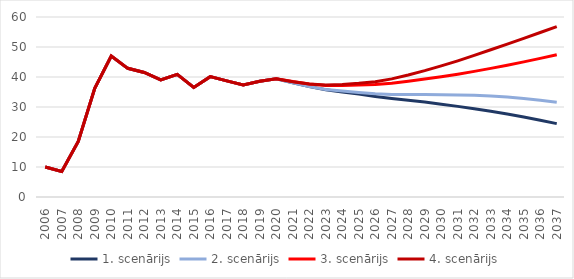
| Category | 1. scenārijs | 2. scenārijs | 3. scenārijs | 4. scenārijs |
|---|---|---|---|---|
| 2006 | 10.012 | 10.012 | 10.012 | 10.012 |
| 2007 | 8.507 | 8.507 | 8.507 | 8.507 |
| 2008 | 18.523 | 18.523 | 18.523 | 18.523 |
| 2009 | 36.251 | 36.251 | 36.251 | 36.251 |
| 2010 | 46.992 | 46.992 | 46.992 | 46.992 |
| 2011 | 42.89 | 42.89 | 42.89 | 42.89 |
| 2012 | 41.516 | 41.516 | 41.516 | 41.516 |
| 2013 | 39.027 | 39.027 | 39.027 | 39.027 |
| 2014 | 40.879 | 40.879 | 40.879 | 40.879 |
| 2015 | 36.518 | 36.518 | 36.518 | 36.518 |
| 2016 | 40.119 | 40.119 | 40.119 | 40.119 |
| 2017 | 38.716 | 38.716 | 38.716 | 38.716 |
| 2018 | 37.349 | 37.349 | 37.349 | 37.349 |
| 2019 | 38.588 | 38.588 | 38.588 | 38.588 |
| 2020 | 39.4 | 39.4 | 39.4 | 39.4 |
| 2021 | 38.11 | 38.054 | 38.485 | 38.43 |
| 2022 | 36.784 | 36.793 | 37.647 | 37.656 |
| 2023 | 35.726 | 35.849 | 37.19 | 37.316 |
| 2024 | 35.007 | 35.336 | 37.197 | 37.538 |
| 2025 | 34.289 | 34.841 | 37.323 | 37.9 |
| 2026 | 33.523 | 34.407 | 37.514 | 38.453 |
| 2027 | 32.859 | 34.188 | 37.94 | 39.376 |
| 2028 | 32.281 | 34.172 | 38.589 | 40.673 |
| 2029 | 31.648 | 34.147 | 39.306 | 42.116 |
| 2030 | 30.948 | 34.103 | 40.078 | 43.698 |
| 2031 | 30.206 | 34.015 | 40.936 | 45.394 |
| 2032 | 29.419 | 33.876 | 41.879 | 47.203 |
| 2033 | 28.564 | 33.643 | 42.877 | 49.069 |
| 2034 | 27.639 | 33.295 | 43.93 | 50.966 |
| 2035 | 26.649 | 32.834 | 45.042 | 52.89 |
| 2036 | 25.591 | 32.25 | 46.214 | 54.828 |
| 2037 | 24.463 | 31.569 | 47.439 | 56.817 |